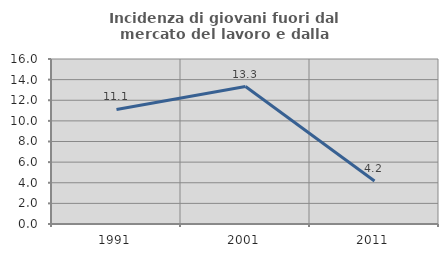
| Category | Incidenza di giovani fuori dal mercato del lavoro e dalla formazione  |
|---|---|
| 1991.0 | 11.111 |
| 2001.0 | 13.333 |
| 2011.0 | 4.167 |